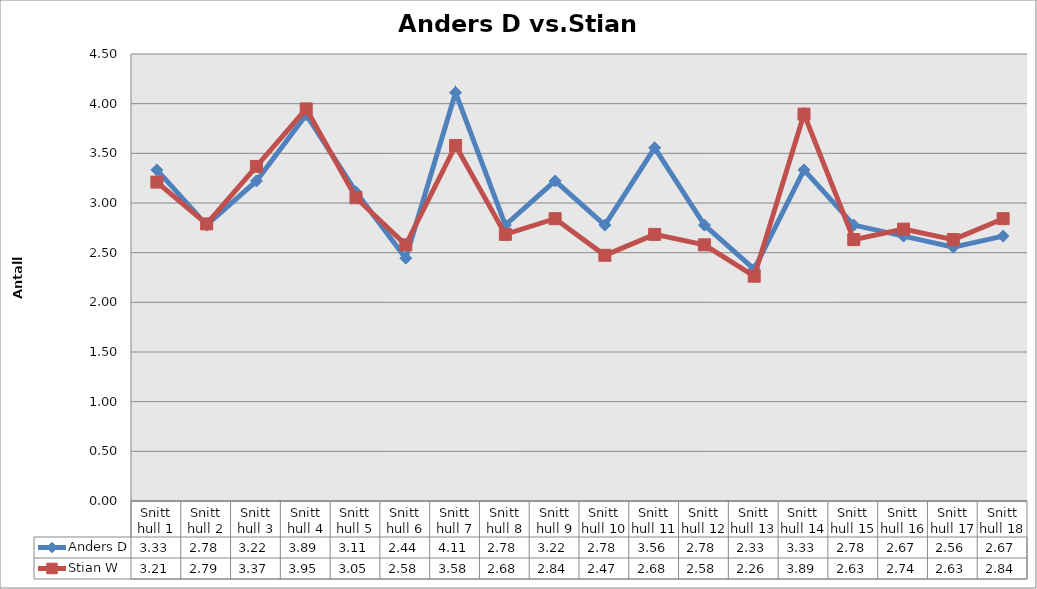
| Category | Anders D | Stian W |
|---|---|---|
| Snitt hull 1 | 3.333 | 3.211 |
| Snitt hull 2 | 2.778 | 2.789 |
| Snitt hull 3 | 3.222 | 3.368 |
| Snitt hull 4 | 3.889 | 3.947 |
| Snitt hull 5 | 3.111 | 3.053 |
| Snitt hull 6 | 2.444 | 2.579 |
| Snitt hull 7 | 4.111 | 3.579 |
| Snitt hull 8 | 2.778 | 2.684 |
| Snitt hull 9 | 3.222 | 2.842 |
| Snitt hull 10 | 2.778 | 2.474 |
| Snitt hull 11 | 3.556 | 2.684 |
| Snitt hull 12 | 2.778 | 2.579 |
| Snitt hull 13 | 2.333 | 2.263 |
| Snitt hull 14 | 3.333 | 3.895 |
| Snitt hull 15 | 2.778 | 2.632 |
| Snitt hull 16 | 2.667 | 2.737 |
| Snitt hull 17 | 2.556 | 2.632 |
| Snitt hull 18 | 2.667 | 2.842 |